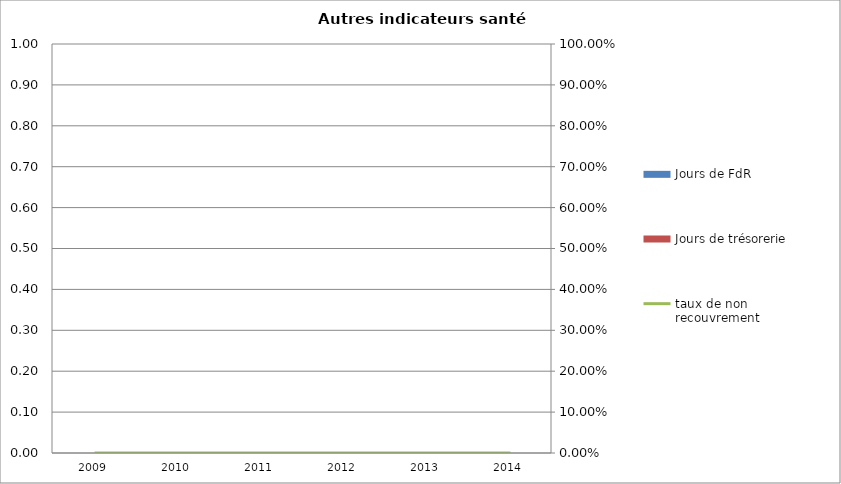
| Category | Jours de FdR | Jours de trésorerie |
|---|---|---|
| 2009.0 | 0 | 0 |
| 2010.0 | 0 | 0 |
| 2011.0 | 0 | 0 |
| 2012.0 | 0 | 0 |
| 2013.0 | 0 | 0 |
| 2014.0 | 0 | 0 |